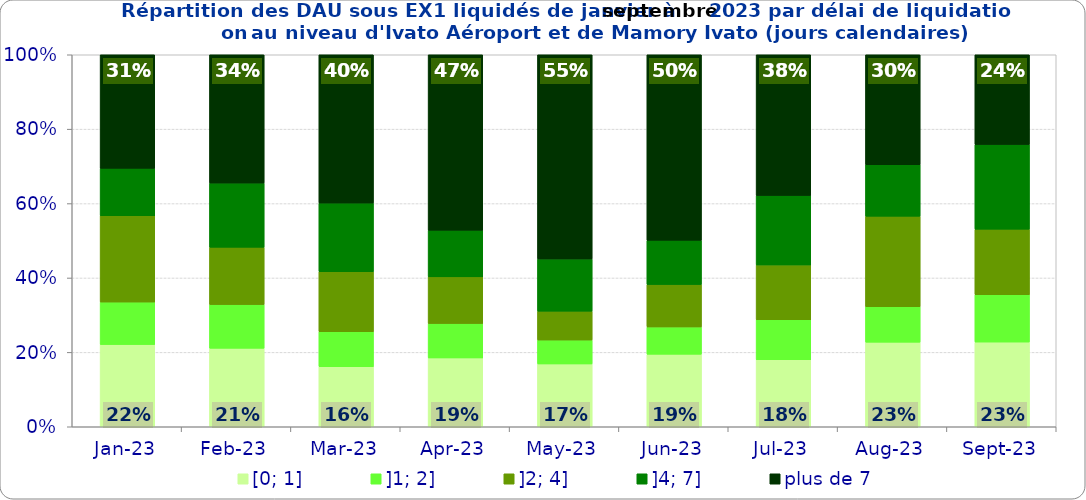
| Category | [0; 1] | ]1; 2] | ]2; 4] | ]4; 7] | plus de 7 |
|---|---|---|---|---|---|
| 2023-01-01 | 0.221 | 0.114 | 0.232 | 0.127 | 0.305 |
| 2023-02-01 | 0.211 | 0.117 | 0.154 | 0.172 | 0.345 |
| 2023-03-01 | 0.161 | 0.094 | 0.161 | 0.185 | 0.399 |
| 2023-04-01 | 0.185 | 0.093 | 0.125 | 0.125 | 0.472 |
| 2023-05-01 | 0.169 | 0.064 | 0.078 | 0.14 | 0.549 |
| 2023-06-01 | 0.195 | 0.073 | 0.114 | 0.119 | 0.499 |
| 2023-07-01 | 0.18 | 0.108 | 0.147 | 0.187 | 0.378 |
| 2023-08-01 | 0.227 | 0.095 | 0.243 | 0.138 | 0.296 |
| 2023-09-01 | 0.228 | 0.127 | 0.176 | 0.228 | 0.241 |